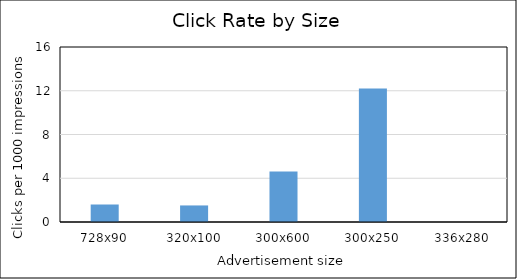
| Category | Series 0 |
|---|---|
| 728x90 | 1.6 |
| 320x100 | 1.514 |
| 300x600 | 4.614 |
| 300x250 | 12.195 |
| 336x280 | 0 |